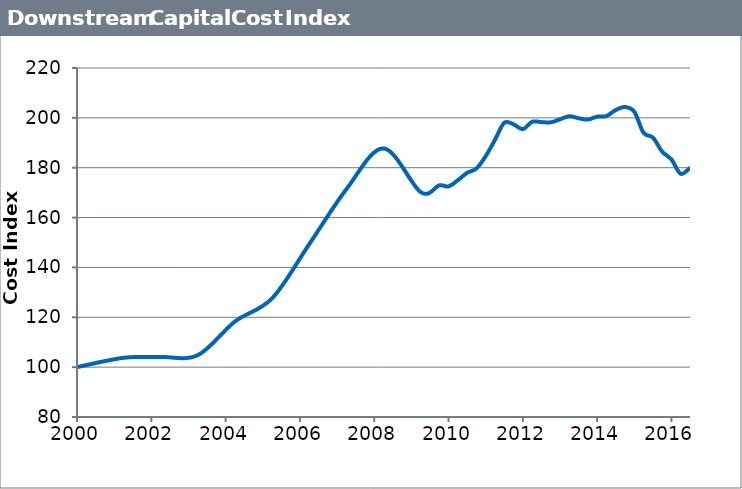
| Category | Series 1 |
|---|---|
| 2000.0 | 100 |
| 2001.25 | 103.742 |
| 2002.25 | 104.08 |
| 2003.25 | 104.788 |
| 2004.25 | 118.291 |
| 2005.25 | 127.578 |
| 2006.25 | 149.32 |
| 2007.25 | 171.348 |
| 2008.25 | 187.749 |
| 2009.25 | 170.2 |
| 2009.75 | 172.9 |
| 2010.0 | 172.5 |
| 2010.25 | 174.98 |
| 2010.5 | 177.93 |
| 2010.75 | 179.66 |
| 2011.0 | 184.61 |
| 2011.25 | 191.18 |
| 2011.5 | 198.02 |
| 2011.75 | 197.4 |
| 2012.0 | 195.48 |
| 2012.25 | 198.42 |
| 2012.5 | 198.3 |
| 2012.75 | 198.2 |
| 2013.0 | 199.4 |
| 2013.25 | 200.64 |
| 2013.5 | 199.86 |
| 2013.75 | 199.31 |
| 2014.0 | 200.49 |
| 2014.25 | 200.73 |
| 2014.5 | 203.13 |
| 2014.75 | 204.36 |
| 2015.0 | 202.46 |
| 2015.25 | 193.99 |
| 2015.5 | 192.12 |
| 2015.75 | 186.47 |
| 2016.0 | 183.3 |
| 2016.25 | 177.57 |
| 2016.5 | 180.01 |